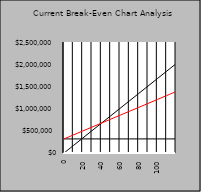
| Category | REVENUE | FIXED COSTS | TOTAL COSTS |
|---|---|---|---|
| 0.0 | 0 | 317133 | 317133 |
| 10.0 | 167500 | 317133 | 405883 |
| 20.0 | 335000 | 317133 | 494633 |
| 30.0 | 502500 | 317133 | 583383 |
| 40.0 | 670000 | 317133 | 672133 |
| 50.0 | 837500 | 317133 | 760883 |
| 60.0 | 1005000 | 317133 | 849633 |
| 70.0 | 1172500 | 317133 | 938383 |
| 80.0 | 1340000 | 317133 | 1027133 |
| 90.0 | 1507500 | 317133 | 1115883 |
| 100.0 | 1675000 | 317133 | 1204633 |
| 110.0 | 1842500 | 317133 | 1293383 |